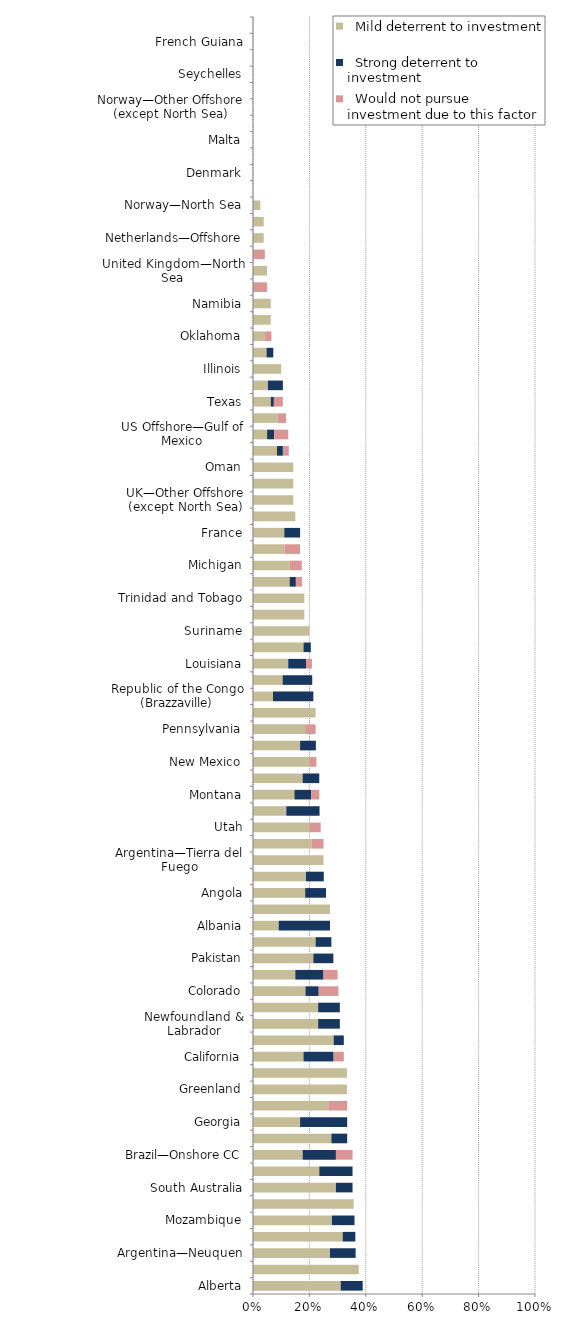
| Category |   Mild deterrent to investment |   Strong deterrent to investment |   Would not pursue investment due to this factor |
|---|---|---|---|
| Alberta | 0.311 | 0.078 | 0 |
| Cyprus | 0.375 | 0 | 0 |
| Argentina—Neuquen | 0.273 | 0.091 | 0 |
| Brunei | 0.318 | 0.045 | 0 |
| Mozambique | 0.28 | 0.08 | 0 |
| West Virginia | 0.357 | 0 | 0 |
| South Australia | 0.294 | 0.059 | 0 |
| Italy | 0.235 | 0.118 | 0 |
| Brazil—Onshore CC | 0.176 | 0.118 | 0.059 |
| New Zealand | 0.278 | 0.056 | 0 |
| Georgia | 0.167 | 0.167 | 0 |
| Argentina—Mendoza | 0.267 | 0 | 0.067 |
| Greenland | 0.333 | 0 | 0 |
| Kuwait | 0.333 | 0 | 0 |
| California | 0.179 | 0.107 | 0.036 |
| Ghana | 0.286 | 0.036 | 0 |
| Newfoundland & Labrador | 0.231 | 0.077 | 0 |
| US Offshore—Alaska | 0.231 | 0.077 | 0 |
| Colorado | 0.186 | 0.047 | 0.07 |
| Tunisia | 0.15 | 0.1 | 0.05 |
| Pakistan | 0.214 | 0.071 | 0 |
| Romania | 0.222 | 0.056 | 0 |
| Albania | 0.091 | 0.182 | 0 |
| Bulgaria | 0.273 | 0 | 0 |
| Angola | 0.185 | 0.074 | 0 |
| Chile | 0.188 | 0.063 | 0 |
| Argentina—Tierra del Fuego | 0.25 | 0 | 0 |
| Brazil—Offshore presalt area PSC | 0.208 | 0 | 0.042 |
| Utah | 0.2 | 0 | 0.04 |
| Algeria | 0.118 | 0.118 | 0 |
| Montana | 0.147 | 0.059 | 0.029 |
| Qatar | 0.176 | 0.059 | 0 |
| New Mexico | 0.2 | 0 | 0.025 |
| United Arab Emirates | 0.167 | 0.056 | 0 |
| Pennsylvania | 0.185 | 0 | 0.037 |
| Hungary | 0.222 | 0 | 0 |
| Republic of the Congo (Brazzaville) | 0.071 | 0.143 | 0 |
| Ivory Coast | 0.105 | 0.105 | 0 |
| Louisiana | 0.125 | 0.063 | 0.021 |
| Australia—Offshore | 0.179 | 0.026 | 0 |
| Suriname | 0.2 | 0 | 0 |
| Guyana | 0.182 | 0 | 0 |
| Trinidad and Tobago | 0.182 | 0 | 0 |
| Wyoming | 0.13 | 0.022 | 0.022 |
| Michigan | 0.13 | 0 | 0.043 |
| Alabama | 0.111 | 0 | 0.056 |
| France | 0.111 | 0.056 | 0 |
| Ohio | 0.15 | 0 | 0 |
| UK—Other Offshore (except North Sea) | 0.143 | 0 | 0 |
| Japan | 0.143 | 0 | 0 |
| Oman | 0.143 | 0 | 0 |
| North Dakota | 0.085 | 0.021 | 0.021 |
| US Offshore—Gulf of Mexico | 0.05 | 0.025 | 0.05 |
| Kansas | 0.088 | 0 | 0.029 |
| Texas | 0.063 | 0.011 | 0.032 |
| Ireland | 0.053 | 0.053 | 0 |
| Illinois | 0.1 | 0 | 0 |
| Saskatchewan | 0.048 | 0.024 | 0 |
| Oklahoma | 0.043 | 0 | 0.022 |
| Germany | 0.063 | 0 | 0 |
| Namibia | 0.063 | 0 | 0 |
| Arkansas | 0 | 0 | 0.05 |
| United Kingdom—North Sea | 0.05 | 0 | 0 |
| Mississippi | 0 | 0 | 0.042 |
| Netherlands—Offshore | 0.038 | 0 | 0 |
| Brazil—Offshore CC | 0.038 | 0 | 0 |
| Norway—North Sea | 0.026 | 0 | 0 |
| Manitoba | 0 | 0 | 0 |
| Denmark | 0 | 0 | 0 |
| Faroe Islands | 0 | 0 | 0 |
| Malta | 0 | 0 | 0 |
| Netherlands—Onshore | 0 | 0 | 0 |
| Norway—Other Offshore (except North Sea) | 0 | 0 | 0 |
| Poland | 0 | 0 | 0 |
| Seychelles | 0 | 0 | 0 |
| Jordan | 0 | 0 | 0 |
| French Guiana | 0 | 0 | 0 |
| Uruguay | 0 | 0 | 0 |